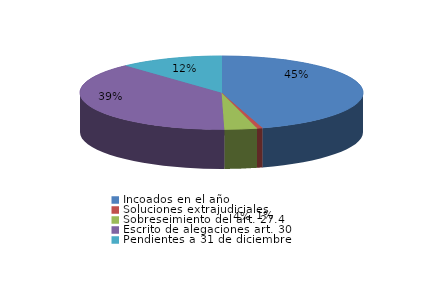
| Category | Series 0 |
|---|---|
| Incoados en el año | 73 |
| Soluciones extrajudiciales | 1 |
| Sobreseimiento del art. 27.4 | 6 |
| Escrito de alegaciones art. 30 | 62 |
| Pendientes a 31 de diciembre | 19 |